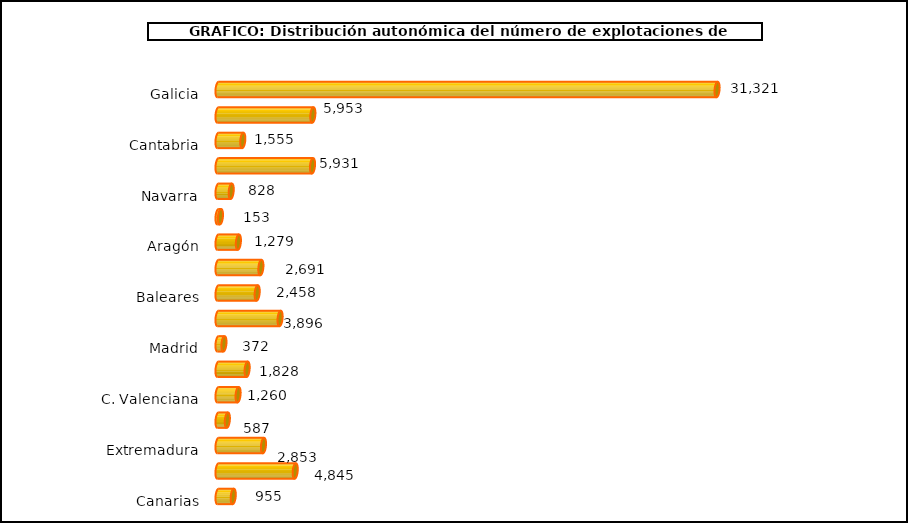
| Category | num. Explotaciones |
|---|---|
| 0 | 31321 |
| 1 | 5953 |
| 2 | 1555 |
| 3 | 5931 |
| 4 | 828 |
| 5 | 153 |
| 6 | 1279 |
| 7 | 2691 |
| 8 | 2458 |
| 9 | 3896 |
| 10 | 372 |
| 11 | 1828 |
| 12 | 1260 |
| 13 | 587 |
| 14 | 2853 |
| 15 | 4845 |
| 16 | 955 |